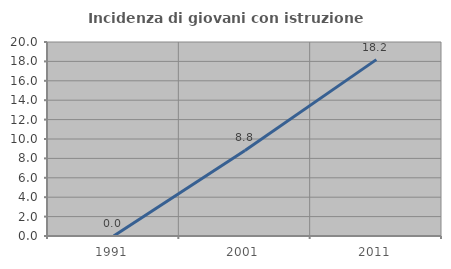
| Category | Incidenza di giovani con istruzione universitaria |
|---|---|
| 1991.0 | 0 |
| 2001.0 | 8.824 |
| 2011.0 | 18.182 |